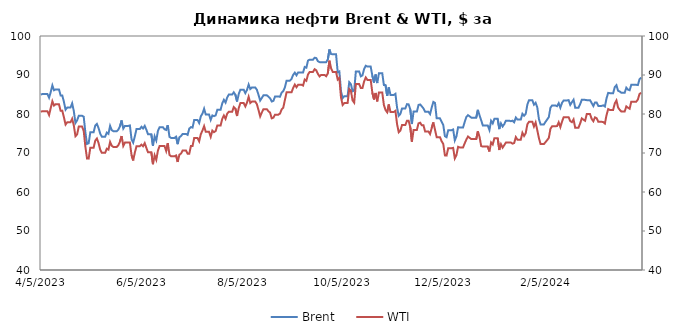
| Category | Brent |
|---|---|
| 4/3/24 | 89.35 |
| 4/2/24 | 88.92 |
| 4/1/24 | 87.42 |
| 3/31/24 | 87.48 |
| 3/30/24 | 87.48 |
| 3/29/24 | 87.48 |
| 3/28/24 | 87.48 |
| 3/27/24 | 86.09 |
| 3/26/24 | 86.25 |
| 3/25/24 | 86.75 |
| 3/24/24 | 85.43 |
| 3/23/24 | 85.43 |
| 3/22/24 | 85.43 |
| 3/21/24 | 85.78 |
| 3/20/24 | 85.95 |
| 3/19/24 | 87.38 |
| 3/18/24 | 86.89 |
| 3/17/24 | 85.34 |
| 3/16/24 | 85.34 |
| 3/15/24 | 85.34 |
| 3/14/24 | 85.42 |
| 3/13/24 | 84.03 |
| 3/12/24 | 81.92 |
| 3/11/24 | 82.21 |
| 3/10/24 | 82.08 |
| 3/9/24 | 82.08 |
| 3/8/24 | 82.08 |
| 3/7/24 | 82.96 |
| 3/6/24 | 82.96 |
| 3/5/24 | 82.04 |
| 3/4/24 | 82.8 |
| 3/3/24 | 83.55 |
| 3/2/24 | 83.55 |
| 3/1/24 | 83.55 |
| 2/29/24 | 83.62 |
| 2/28/24 | 83.68 |
| 2/27/24 | 83.65 |
| 2/26/24 | 82.53 |
| 2/25/24 | 81.62 |
| 2/24/24 | 81.62 |
| 2/23/24 | 81.62 |
| 2/22/24 | 83.67 |
| 2/21/24 | 83.03 |
| 2/20/24 | 82.34 |
| 2/19/24 | 83.56 |
| 2/18/24 | 83.47 |
| 2/17/24 | 83.47 |
| 2/16/24 | 83.47 |
| 2/15/24 | 82.86 |
| 2/14/24 | 81.6 |
| 2/13/24 | 82.77 |
| 2/12/24 | 82 |
| 2/11/24 | 82.19 |
| 2/10/24 | 82.19 |
| 2/9/24 | 82.19 |
| 2/8/24 | 81.63 |
| 2/7/24 | 79.21 |
| 2/6/24 | 78.59 |
| 2/5/24 | 77.99 |
| 2/4/24 | 77.33 |
| 2/3/24 | 77.33 |
| 2/2/24 | 77.33 |
| 2/1/24 | 78.7 |
| 1/31/24 | 81.71 |
| 1/30/24 | 82.87 |
| 1/29/24 | 82.4 |
| 1/28/24 | 83.55 |
| 1/27/24 | 83.55 |
| 1/26/24 | 83.55 |
| 1/25/24 | 82.43 |
| 1/24/24 | 80.04 |
| 1/23/24 | 79.55 |
| 1/22/24 | 80.06 |
| 1/21/24 | 78.56 |
| 1/20/24 | 78.56 |
| 1/19/24 | 78.56 |
| 1/18/24 | 79.1 |
| 1/17/24 | 77.88 |
| 1/16/24 | 78.29 |
| 1/15/24 | 78.15 |
| 1/14/24 | 78.29 |
| 1/13/24 | 78.29 |
| 1/12/24 | 78.29 |
| 1/11/24 | 77.41 |
| 1/10/24 | 76.8 |
| 1/9/24 | 77.59 |
| 1/8/24 | 76.12 |
| 1/7/24 | 78.76 |
| 1/6/24 | 78.76 |
| 1/5/24 | 78.76 |
| 1/4/24 | 77.59 |
| 1/3/24 | 78.25 |
| 1/2/24 | 75.89 |
| 1/1/24 | 77.04 |
| 12/31/23 | 77.04 |
| 12/30/23 | 77.04 |
| 12/29/23 | 77.04 |
| 12/28/23 | 78.39 |
| 12/27/23 | 79.65 |
| 12/26/23 | 81.07 |
| 12/25/23 | 79.07 |
| 12/24/23 | 79.07 |
| 12/23/23 | 79.07 |
| 12/22/23 | 79.07 |
| 12/21/23 | 79.39 |
| 12/20/23 | 79.7 |
| 12/19/23 | 79.23 |
| 12/18/23 | 77.95 |
| 12/17/23 | 76.55 |
| 12/16/23 | 76.55 |
| 12/15/23 | 76.55 |
| 12/14/23 | 76.61 |
| 12/13/23 | 74.26 |
| 12/12/23 | 73.24 |
| 12/11/23 | 76.03 |
| 12/10/23 | 75.84 |
| 12/9/23 | 75.84 |
| 12/8/23 | 75.84 |
| 12/7/23 | 74.05 |
| 12/6/23 | 74.3 |
| 12/5/23 | 77.2 |
| 12/4/23 | 78.03 |
| 12/3/23 | 78.88 |
| 12/2/23 | 78.88 |
| 12/1/23 | 78.88 |
| 11/30/23 | 82.83 |
| 11/29/23 | 83.1 |
| 11/28/23 | 81.68 |
| 11/27/23 | 79.98 |
| 11/26/23 | 80.58 |
| 11/25/23 | 80.58 |
| 11/24/23 | 80.58 |
| 11/23/23 | 81.42 |
| 11/22/23 | 81.96 |
| 11/21/23 | 82.45 |
| 11/20/23 | 82.32 |
| 11/19/23 | 80.61 |
| 11/18/23 | 80.61 |
| 11/17/23 | 80.61 |
| 11/16/23 | 77.42 |
| 11/15/23 | 81.18 |
| 11/14/23 | 82.47 |
| 11/13/23 | 82.52 |
| 11/12/23 | 81.43 |
| 11/11/23 | 81.43 |
| 11/10/23 | 81.43 |
| 11/9/23 | 80.01 |
| 11/8/23 | 79.54 |
| 11/7/23 | 81.61 |
| 11/6/23 | 85.18 |
| 11/5/23 | 84.89 |
| 11/4/23 | 84.89 |
| 11/3/23 | 84.89 |
| 11/2/23 | 86.85 |
| 11/1/23 | 84.63 |
| 10/31/23 | 87.41 |
| 10/30/23 | 87.45 |
| 10/29/23 | 90.48 |
| 10/28/23 | 90.48 |
| 10/27/23 | 90.48 |
| 10/26/23 | 87.93 |
| 10/25/23 | 90.13 |
| 10/24/23 | 88.07 |
| 10/23/23 | 89.83 |
| 10/22/23 | 92.16 |
| 10/21/23 | 92.16 |
| 10/20/23 | 92.16 |
| 10/19/23 | 92.38 |
| 10/18/23 | 91.5 |
| 10/17/23 | 89.9 |
| 10/16/23 | 89.65 |
| 10/15/23 | 90.89 |
| 10/14/23 | 90.89 |
| 10/13/23 | 90.89 |
| 10/12/23 | 86 |
| 10/11/23 | 85.82 |
| 10/10/23 | 87.65 |
| 10/9/23 | 88.15 |
| 10/8/23 | 84.58 |
| 10/7/23 | 84.58 |
| 10/6/23 | 84.58 |
| 10/5/23 | 84.07 |
| 10/4/23 | 85.81 |
| 10/3/23 | 90.92 |
| 10/2/23 | 90.71 |
| 10/1/23 | 95.31 |
| 9/30/23 | 95.31 |
| 9/29/23 | 95.31 |
| 9/28/23 | 95.38 |
| 9/27/23 | 96.55 |
| 9/26/23 | 93.96 |
| 9/25/23 | 93.29 |
| 9/24/23 | 93.27 |
| 9/23/23 | 93.27 |
| 9/22/23 | 93.27 |
| 9/21/23 | 93.3 |
| 9/20/23 | 93.53 |
| 9/19/23 | 94.34 |
| 9/18/23 | 94.43 |
| 9/17/23 | 93.93 |
| 9/16/23 | 93.93 |
| 9/15/23 | 93.93 |
| 9/14/23 | 93.7 |
| 9/13/23 | 91.88 |
| 9/12/23 | 92.06 |
| 9/11/23 | 90.64 |
| 9/10/23 | 90.65 |
| 9/9/23 | 90.65 |
| 9/8/23 | 90.65 |
| 9/7/23 | 89.92 |
| 9/6/23 | 90.6 |
| 9/5/23 | 90.04 |
| 9/4/23 | 89 |
| 9/3/23 | 88.55 |
| 9/2/23 | 88.55 |
| 9/1/23 | 88.55 |
| 8/31/23 | 86.86 |
| 8/30/23 | 85.86 |
| 8/29/23 | 85.49 |
| 8/28/23 | 84.42 |
| 8/27/23 | 84.48 |
| 8/26/23 | 84.48 |
| 8/25/23 | 84.48 |
| 8/24/23 | 83.36 |
| 8/23/23 | 83.21 |
| 8/22/23 | 84.03 |
| 8/21/23 | 84.46 |
| 8/20/23 | 84.8 |
| 8/19/23 | 84.8 |
| 8/18/23 | 84.8 |
| 8/17/23 | 84.12 |
| 8/16/23 | 83.45 |
| 8/15/23 | 84.89 |
| 8/14/23 | 86.21 |
| 8/13/23 | 86.81 |
| 8/12/23 | 86.81 |
| 8/11/23 | 86.81 |
| 8/10/23 | 86.4 |
| 8/9/23 | 87.55 |
| 8/8/23 | 86.17 |
| 8/7/23 | 85.34 |
| 8/6/23 | 86.24 |
| 8/5/23 | 86.24 |
| 8/4/23 | 86.24 |
| 8/3/23 | 85.14 |
| 8/2/23 | 83.2 |
| 8/1/23 | 84.91 |
| 7/31/23 | 85.56 |
| 7/30/23 | 84.99 |
| 7/29/23 | 84.99 |
| 7/28/23 | 84.99 |
| 7/27/23 | 84.24 |
| 7/26/23 | 82.92 |
| 7/25/23 | 83.64 |
| 7/24/23 | 82.74 |
| 7/23/23 | 81.07 |
| 7/22/23 | 81.07 |
| 7/21/23 | 81.07 |
| 7/20/23 | 79.64 |
| 7/19/23 | 79.46 |
| 7/18/23 | 79.63 |
| 7/17/23 | 78.5 |
| 7/16/23 | 79.87 |
| 7/15/23 | 79.87 |
| 7/14/23 | 79.87 |
| 7/13/23 | 81.36 |
| 7/12/23 | 80.11 |
| 7/11/23 | 79.4 |
| 7/10/23 | 77.69 |
| 7/9/23 | 78.47 |
| 7/8/23 | 78.47 |
| 7/7/23 | 78.47 |
| 7/6/23 | 76.52 |
| 7/5/23 | 76.65 |
| 7/4/23 | 76.25 |
| 7/3/23 | 74.65 |
| 7/2/23 | 74.9 |
| 7/1/23 | 74.9 |
| 6/30/23 | 74.9 |
| 6/29/23 | 74.34 |
| 6/28/23 | 74.03 |
| 6/27/23 | 72.26 |
| 6/26/23 | 74.18 |
| 6/25/23 | 73.85 |
| 6/24/23 | 73.85 |
| 6/23/23 | 73.85 |
| 6/22/23 | 74.14 |
| 6/21/23 | 77.12 |
| 6/20/23 | 75.9 |
| 6/19/23 | 76.09 |
| 6/18/23 | 76.61 |
| 6/17/23 | 76.61 |
| 6/16/23 | 76.61 |
| 6/15/23 | 75.67 |
| 6/14/23 | 73.2 |
| 6/13/23 | 74.29 |
| 6/12/23 | 71.84 |
| 6/11/23 | 74.79 |
| 6/10/23 | 74.79 |
| 6/9/23 | 74.79 |
| 6/8/23 | 75.96 |
| 6/7/23 | 76.95 |
| 6/6/23 | 76.29 |
| 6/5/23 | 76.71 |
| 6/4/23 | 76.13 |
| 6/3/23 | 76.13 |
| 6/2/23 | 76.13 |
| 6/1/23 | 74.28 |
| 5/31/23 | 72.66 |
| 5/30/23 | 73.54 |
| 5/29/23 | 77.07 |
| 5/28/23 | 76.95 |
| 5/27/23 | 76.95 |
| 5/26/23 | 76.95 |
| 5/25/23 | 76.26 |
| 5/24/23 | 78.36 |
| 5/23/23 | 76.84 |
| 5/22/23 | 75.99 |
| 5/21/23 | 75.58 |
| 5/20/23 | 75.58 |
| 5/19/23 | 75.58 |
| 5/18/23 | 75.86 |
| 5/17/23 | 76.96 |
| 5/16/23 | 74.91 |
| 5/15/23 | 75.23 |
| 5/14/23 | 74.17 |
| 5/13/23 | 74.17 |
| 5/12/23 | 74.17 |
| 5/11/23 | 74.98 |
| 5/10/23 | 76.41 |
| 5/9/23 | 77.44 |
| 5/8/23 | 77.01 |
| 5/7/23 | 75.3 |
| 5/6/23 | 75.3 |
| 5/5/23 | 75.3 |
| 5/4/23 | 72.5 |
| 5/3/23 | 72.33 |
| 5/2/23 | 75.32 |
| 5/1/23 | 79.31 |
| 4/30/23 | 79.54 |
| 4/29/23 | 79.54 |
| 4/28/23 | 79.54 |
| 4/27/23 | 78.37 |
| 4/26/23 | 77.69 |
| 4/25/23 | 80.77 |
| 4/24/23 | 82.73 |
| 4/23/23 | 81.66 |
| 4/22/23 | 81.66 |
| 4/21/23 | 81.66 |
| 4/20/23 | 81.1 |
| 4/19/23 | 83.12 |
| 4/18/23 | 84.77 |
| 4/17/23 | 84.76 |
| 4/16/23 | 86.31 |
| 4/15/23 | 86.31 |
| 4/14/23 | 86.31 |
| 4/13/23 | 86.09 |
| 4/12/23 | 87.33 |
| 4/11/23 | 85.61 |
| 4/10/23 | 84.18 |
| 4/9/23 | 85.12 |
| 4/8/23 | 85.12 |
| 4/7/23 | 85.12 |
| 4/6/23 | 85.12 |
| 4/5/23 | 84.99 |